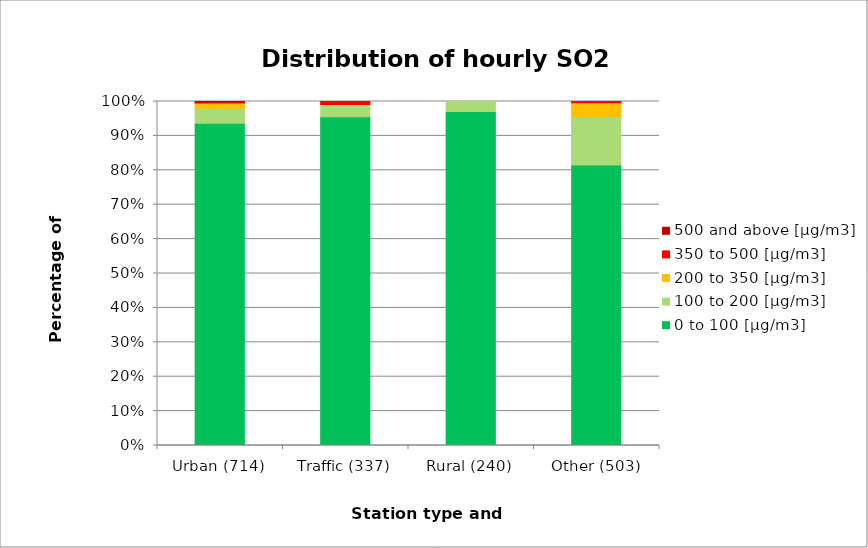
| Category | 0 to 100 [µg/m3] | 100 to 200 [µg/m3] | 200 to 350 [µg/m3] | 350 to 500 [µg/m3] | 500 and above [µg/m3] |
|---|---|---|---|---|---|
| Urban (714) | 0.937 | 0.043 | 0.015 | 0.003 | 0.001 |
| Traffic (337) | 0.956 | 0.036 | 0 | 0.009 | 0 |
| Rural (240) | 0.971 | 0.029 | 0 | 0 | 0 |
| Other (503) | 0.815 | 0.141 | 0.04 | 0.004 | 0 |